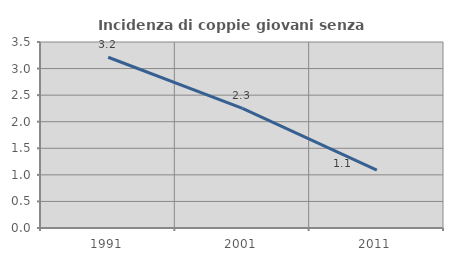
| Category | Incidenza di coppie giovani senza figli |
|---|---|
| 1991.0 | 3.213 |
| 2001.0 | 2.252 |
| 2011.0 | 1.087 |